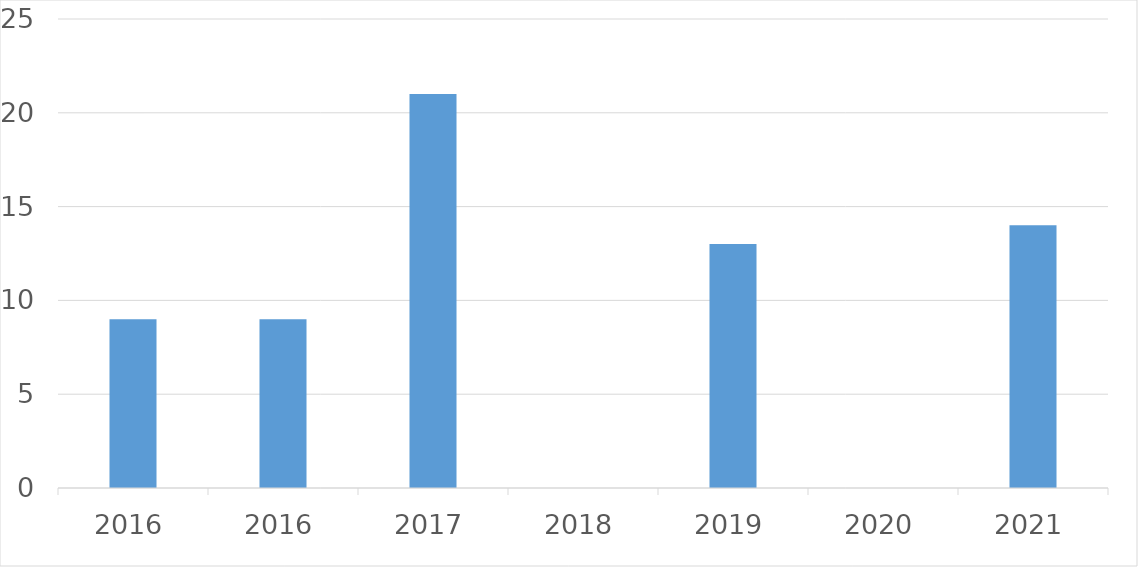
| Category | Series 0 |
|---|---|
| 2016 | 9 |
| 2016 | 9 |
| 2017 | 21 |
| 2018 | 0 |
| 2019 | 13 |
| 2020 | 0 |
| 2021 | 14 |